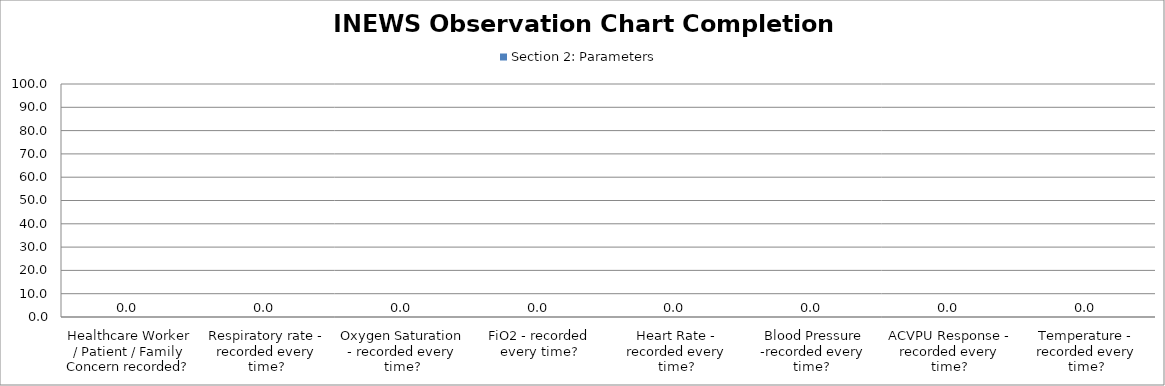
| Category | Section 2: Parameters |
|---|---|
| Healthcare Worker / Patient / Family Concern recorded? | 0 |
| Respiratory rate - recorded every time? | 0 |
| Oxygen Saturation - recorded every time? | 0 |
| FiO2 - recorded every time? | 0 |
| Heart Rate - recorded every time? | 0 |
| Blood Pressure -recorded every time?  | 0 |
| ACVPU Response - recorded every time? | 0 |
| Temperature - recorded every time? | 0 |